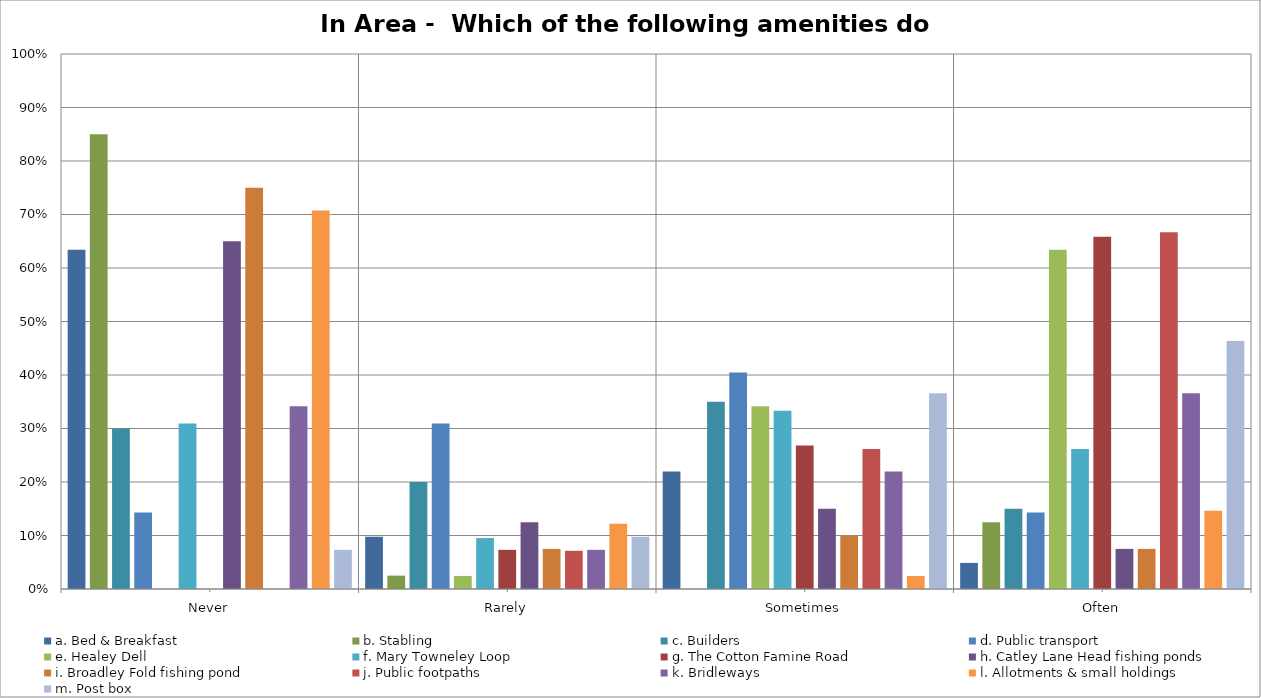
| Category | a. Bed & Breakfast | b. Stabling | c. Builders | d. Public transport | e. Healey Dell | f. Mary Towneley Loop | g. The Cotton Famine Road | h. Catley Lane Head fishing ponds | i. Broadley Fold fishing pond | j. Public footpaths | k. Bridleways | l. Allotments & small holdings | m. Post box |
|---|---|---|---|---|---|---|---|---|---|---|---|---|---|
| Never | 0.634 | 0.85 | 0.3 | 0.143 | 0 | 0.31 | 0 | 0.65 | 0.75 | 0 | 0.341 | 0.707 | 0.073 |
| Rarely | 0.098 | 0.025 | 0.2 | 0.31 | 0.024 | 0.095 | 0.073 | 0.125 | 0.075 | 0.071 | 0.073 | 0.122 | 0.098 |
| Sometimes | 0.22 | 0 | 0.35 | 0.405 | 0.341 | 0.333 | 0.268 | 0.15 | 0.1 | 0.262 | 0.22 | 0.024 | 0.366 |
| Often | 0.049 | 0.125 | 0.15 | 0.143 | 0.634 | 0.262 | 0.659 | 0.075 | 0.075 | 0.667 | 0.366 | 0.146 | 0.463 |